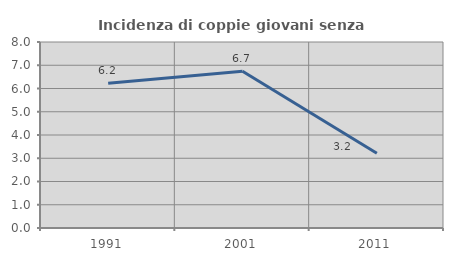
| Category | Incidenza di coppie giovani senza figli |
|---|---|
| 1991.0 | 6.222 |
| 2001.0 | 6.742 |
| 2011.0 | 3.213 |